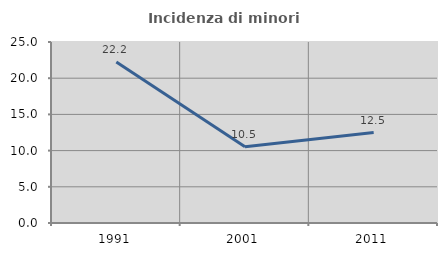
| Category | Incidenza di minori stranieri |
|---|---|
| 1991.0 | 22.222 |
| 2001.0 | 10.526 |
| 2011.0 | 12.5 |